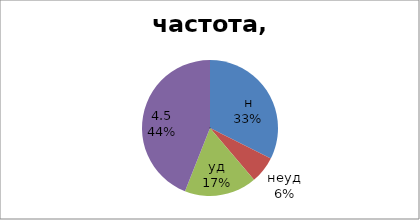
| Category | ч,% |
|---|---|
| н | 32.4 |
| неуд | 6.4 |
| уд | 17.2 |
| 4,5 | 44 |